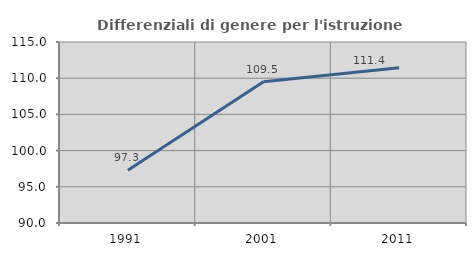
| Category | Differenziali di genere per l'istruzione superiore |
|---|---|
| 1991.0 | 97.28 |
| 2001.0 | 109.525 |
| 2011.0 | 111.45 |